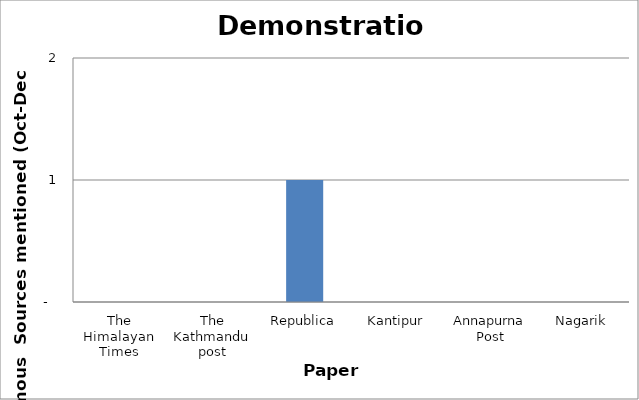
| Category | Demonstration |
|---|---|
| The Himalayan Times | 0 |
| The Kathmandu post | 0 |
| Republica | 1 |
| Kantipur | 0 |
| Annapurna Post | 0 |
| Nagarik | 0 |